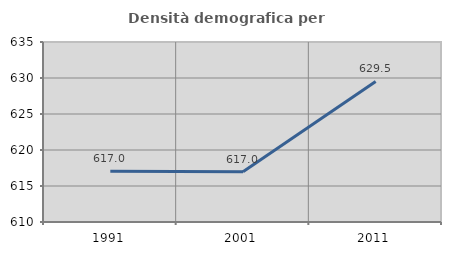
| Category | Densità demografica |
|---|---|
| 1991.0 | 617.046 |
| 2001.0 | 616.972 |
| 2011.0 | 629.519 |